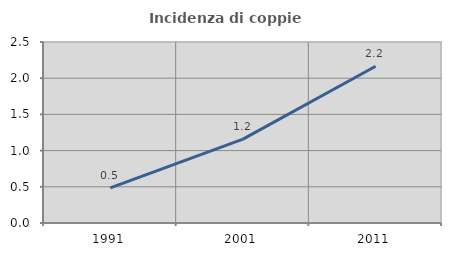
| Category | Incidenza di coppie miste |
|---|---|
| 1991.0 | 0.485 |
| 2001.0 | 1.158 |
| 2011.0 | 2.165 |